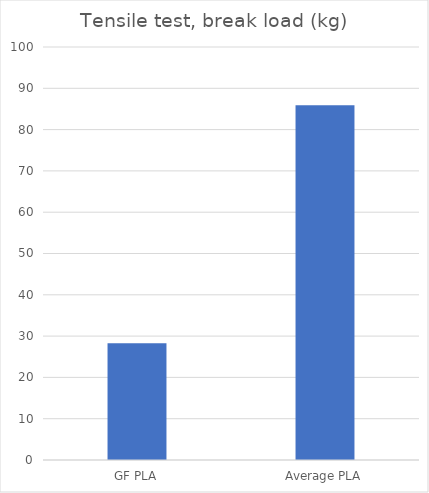
| Category | Average |
|---|---|
| GF PLA | 28.25 |
| Average PLA | 85.9 |